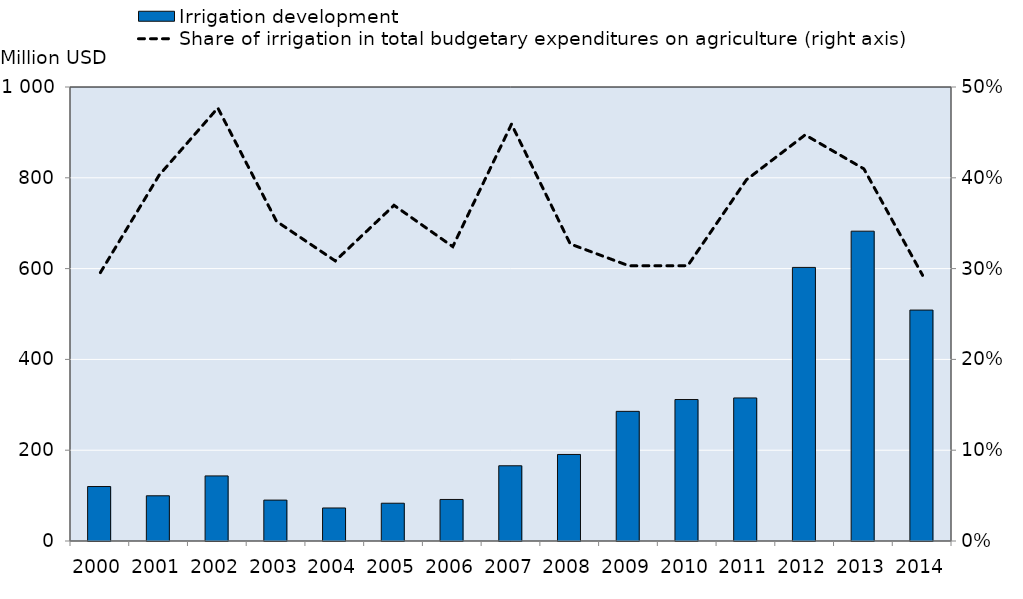
| Category | Irrigation development |
|---|---|
| 2000.0 | 120.005 |
| 2001.0 | 99.6 |
| 2002.0 | 143.361 |
| 2003.0 | 90.085 |
| 2004.0 | 72.734 |
| 2005.0 | 83.211 |
| 2006.0 | 91.511 |
| 2007.0 | 165.703 |
| 2008.0 | 190.632 |
| 2009.0 | 285.57 |
| 2010.0 | 311.609 |
| 2011.0 | 315.111 |
| 2012.0 | 602.614 |
| 2013.0 | 682.41 |
| 2014.0 | 508.672 |